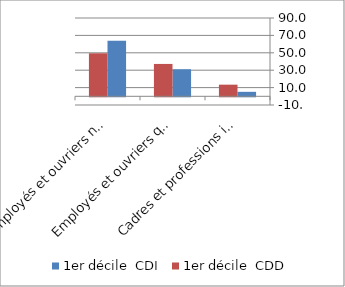
| Category | 1er décile  CDI | 1er décile  CDD |
|---|---|---|
| Cadres et professions intermédiaires | 5.15 | 13.368 |
| Employés et ouvriers qualifiés | 31.109 | 37.2 |
| Employés et ouvriers non qualifiés | 63.741 | 49.432 |